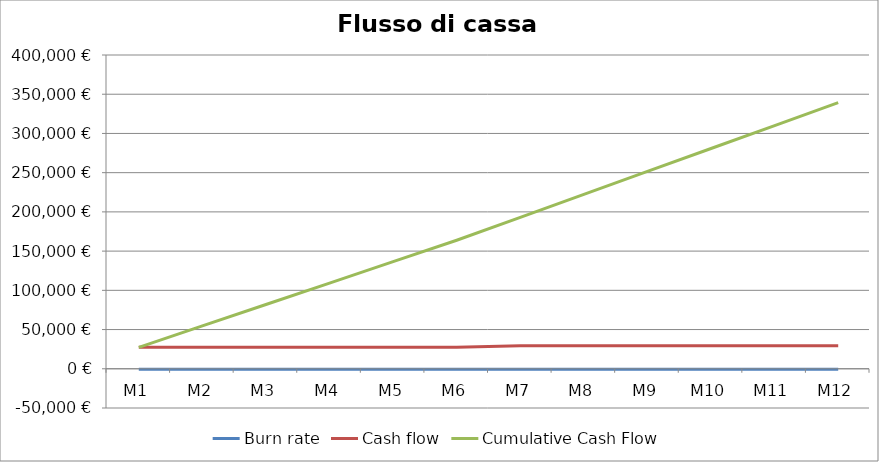
| Category | Burn rate | Cash flow | Cumulative Cash Flow |
|---|---|---|---|
| M1 | -700 | 27300 | 27300 |
| M2 | -700 | 27300 | 54600 |
| M3 | -700 | 27300 | 81900 |
| M4 | -700 | 27300 | 109200 |
| M5 | -700 | 27300 | 136500 |
| M6 | -700 | 27300 | 163800 |
| M7 | -750 | 29250 | 193050 |
| M8 | -750 | 29250 | 222300 |
| M9 | -750 | 29250 | 251550 |
| M10 | -750 | 29250 | 280800 |
| M11 | -750 | 29250 | 310050 |
| M12 | -750 | 29250 | 339300 |